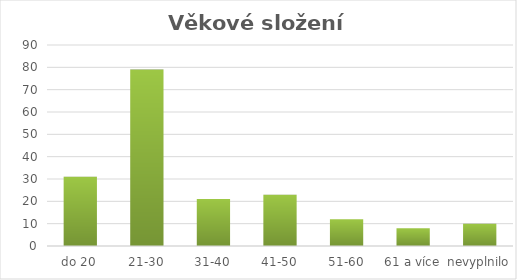
| Category | celkem |
|---|---|
| do 20 | 31 |
| 21-30 | 79 |
| 31-40 | 21 |
| 41-50 | 23 |
| 51-60 | 12 |
| 61 a více | 8 |
| nevyplnilo | 10 |